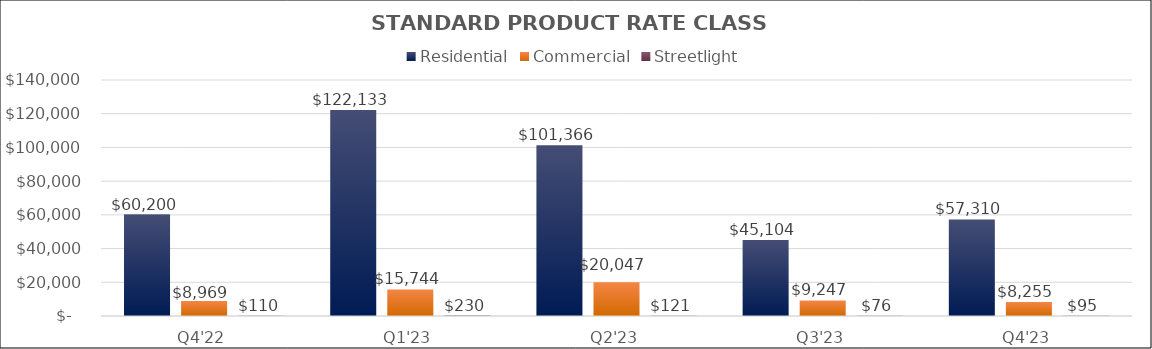
| Category | Residential | Commercial | Streetlight |
|---|---|---|---|
| Q4'22 | 60199.765 | 8969.257 | 109.711 |
| Q1'23 | 122133.298 | 15743.945 | 229.88 |
| Q2'23 | 101365.531 | 20047.374 | 120.991 |
| Q3'23 | 45103.781 | 9246.881 | 75.628 |
| Q4'23 | 57309.686 | 8255.498 | 95.226 |